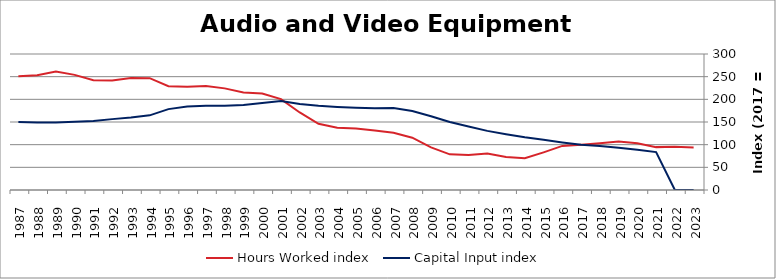
| Category | Hours Worked index | Capital Input index |
|---|---|---|
| 2023.0 | 93.622 | 0 |
| 2022.0 | 95.243 | 0 |
| 2021.0 | 94.579 | 83.578 |
| 2020.0 | 103.037 | 88.905 |
| 2019.0 | 107.104 | 93.139 |
| 2018.0 | 103.122 | 96.887 |
| 2017.0 | 100 | 100 |
| 2016.0 | 97.231 | 104.885 |
| 2015.0 | 83.1 | 110.624 |
| 2014.0 | 69.941 | 116.227 |
| 2013.0 | 72.982 | 123.045 |
| 2012.0 | 80.616 | 130.418 |
| 2011.0 | 76.959 | 139.859 |
| 2010.0 | 78.703 | 149.853 |
| 2009.0 | 94.044 | 162.698 |
| 2008.0 | 115.35 | 174.053 |
| 2007.0 | 126.346 | 181.033 |
| 2006.0 | 131.08 | 180.235 |
| 2005.0 | 135.795 | 181.596 |
| 2004.0 | 137.093 | 183.291 |
| 2003.0 | 145.917 | 185.601 |
| 2002.0 | 171.033 | 189.764 |
| 2001.0 | 200.414 | 196.268 |
| 2000.0 | 213.043 | 191.761 |
| 1999.0 | 215.263 | 187.283 |
| 1998.0 | 224.173 | 185.823 |
| 1997.0 | 229.644 | 185.899 |
| 1996.0 | 227.829 | 184.404 |
| 1995.0 | 228.841 | 178.435 |
| 1994.0 | 246.779 | 164.719 |
| 1993.0 | 246.921 | 159.951 |
| 1992.0 | 241.698 | 156.336 |
| 1991.0 | 242.359 | 152.215 |
| 1990.0 | 253.958 | 150.313 |
| 1989.0 | 261.095 | 148.675 |
| 1988.0 | 253.193 | 148.704 |
| 1987.0 | 250.654 | 149.967 |